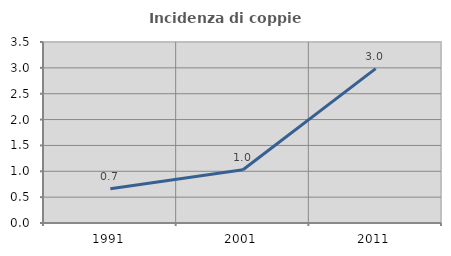
| Category | Incidenza di coppie miste |
|---|---|
| 1991.0 | 0.662 |
| 2001.0 | 1.03 |
| 2011.0 | 2.985 |